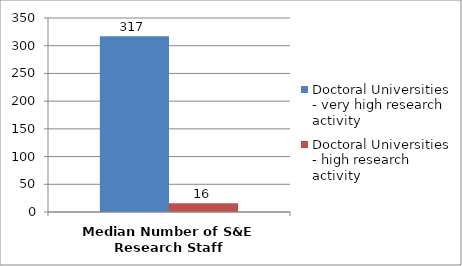
| Category | Doctoral Universities - very high research activity | Doctoral Universities - high research activity |
|---|---|---|
| Median Number of S&E Research Staff | 317 | 16 |